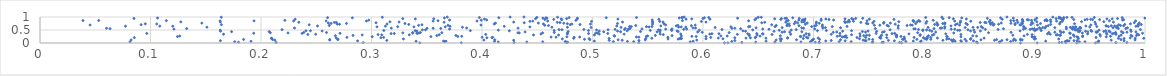
| Category | Series 0 |
|---|---|
| 0.8874117853204427 | 0.001 |
| 0.9383130392352012 | 0.002 |
| 0.9024243052497577 | 0.003 |
| 0.9551818762707995 | 0.004 |
| 0.6194239200750441 | 0.005 |
| 0.34376989689275445 | 0.006 |
| 0.6225813663790141 | 0.007 |
| 0.7797470839452451 | 0.008 |
| 0.3812384314433798 | 0.009 |
| 0.4768851883852392 | 0.01 |
| 0.8483477779431498 | 0.011 |
| 0.7053116924317506 | 0.012 |
| 0.9283258642206476 | 0.013 |
| 0.2924927985265264 | 0.014 |
| 0.9736394388266845 | 0.015 |
| 0.9836523583018227 | 0.016 |
| 0.9224065497863576 | 0.017 |
| 0.42901509922949443 | 0.018 |
| 0.21365363537010196 | 0.019 |
| 0.6351673508141835 | 0.02 |
| 0.5420218229427431 | 0.021 |
| 0.924615316145788 | 0.022 |
| 0.7779224126790676 | 0.023 |
| 0.7620620132401098 | 0.024 |
| 0.701701706354573 | 0.025 |
| 0.7051286134402933 | 0.026 |
| 0.7531521563637567 | 0.027 |
| 0.1796450087162822 | 0.028 |
| 0.47754314144603816 | 0.029 |
| 0.7632223250159949 | 0.03 |
| 0.868154382918569 | 0.031 |
| 0.9580668037224306 | 0.032 |
| 0.753749132467569 | 0.033 |
| 0.6477889585535476 | 0.034 |
| 0.664986416909816 | 0.035 |
| 0.8475552806892548 | 0.036 |
| 0.44057625174129755 | 0.037 |
| 0.9571985644106674 | 0.038 |
| 0.4147441730929578 | 0.039 |
| 0.4752072091520863 | 0.04 |
| 0.6886094760374728 | 0.041 |
| 0.9406482252737258 | 0.042 |
| 0.868799760399531 | 0.043 |
| 0.5883970273256846 | 0.044 |
| 0.08146029462819564 | 0.045 |
| 0.4549578394951104 | 0.046 |
| 0.7232144112385263 | 0.047 |
| 0.6972098812297434 | 0.048 |
| 0.9456472794384384 | 0.049 |
| 0.17622429524262415 | 0.05 |
| 0.7340817588466492 | 0.051 |
| 0.5189203462846952 | 0.052 |
| 0.5372685196248916 | 0.053 |
| 0.9278270877589858 | 0.054 |
| 0.8784007911501208 | 0.055 |
| 0.7968449686767484 | 0.056 |
| 0.47562167751536477 | 0.057 |
| 0.7835596239363156 | 0.058 |
| 0.6260173062117091 | 0.059 |
| 0.36635405198503684 | 0.06 |
| 0.531644379465687 | 0.061 |
| 0.8259658630137685 | 0.062 |
| 0.8337536294329113 | 0.063 |
| 0.4113441293198029 | 0.064 |
| 0.1909723438988555 | 0.065 |
| 0.34035372793807994 | 0.066 |
| 0.8281477854784326 | 0.067 |
| 0.5910888677864203 | 0.068 |
| 0.3673860546116874 | 0.069 |
| 0.6570496152462597 | 0.07 |
| 0.9101174644248593 | 0.071 |
| 0.3651714656968805 | 0.072 |
| 0.7903170055221208 | 0.073 |
| 0.5017034012026388 | 0.074 |
| 0.7974781966237205 | 0.075 |
| 0.8383380356489463 | 0.076 |
| 0.958200542582154 | 0.077 |
| 0.6703292208395912 | 0.078 |
| 0.7111266510560406 | 0.079 |
| 0.9287477583726954 | 0.08 |
| 0.28743905201393155 | 0.081 |
| 0.9312443911991118 | 0.082 |
| 0.8447601030285942 | 0.083 |
| 0.7286414918536218 | 0.084 |
| 0.7731826113477963 | 0.085 |
| 0.9810627498484642 | 0.086 |
| 0.8333150414554711 | 0.087 |
| 0.747536334589459 | 0.088 |
| 0.16326537470962002 | 0.089 |
| 0.9298857479006892 | 0.09 |
| 0.9357279078398784 | 0.091 |
| 0.9386034116247006 | 0.092 |
| 0.7465592067797421 | 0.093 |
| 0.6288352254945148 | 0.094 |
| 0.5420514995684425 | 0.095 |
| 0.8704047116976235 | 0.096 |
| 0.7160767997968895 | 0.097 |
| 0.6985827822400348 | 0.098 |
| 0.8807421288101916 | 0.099 |
| 0.3138249476735683 | 0.1 |
| 0.7677885448344919 | 0.101 |
| 0.515090898844652 | 0.102 |
| 0.817072987291031 | 0.103 |
| 0.8829089607022778 | 0.104 |
| 0.863800681480107 | 0.105 |
| 0.5268830811121472 | 0.106 |
| 0.4286535708365447 | 0.107 |
| 0.969440409912672 | 0.108 |
| 0.7449273315803495 | 0.109 |
| 0.21250316069469818 | 0.11 |
| 0.6989299955615945 | 0.111 |
| 0.2622284488655817 | 0.112 |
| 0.5943905412744519 | 0.113 |
| 0.4017215112637475 | 0.114 |
| 0.824790213435296 | 0.115 |
| 0.6661800751084439 | 0.116 |
| 0.8874174339806783 | 0.117 |
| 0.08245708586949725 | 0.118 |
| 0.9910112338969367 | 0.119 |
| 0.888893210146028 | 0.12 |
| 0.5477638595229355 | 0.121 |
| 0.5231880267570456 | 0.122 |
| 0.8515491665133182 | 0.123 |
| 0.41157375341763053 | 0.124 |
| 0.7244056647519727 | 0.125 |
| 0.6846096263504997 | 0.126 |
| 0.8267270090256246 | 0.127 |
| 0.8751686344587598 | 0.128 |
| 0.4975573723201068 | 0.129 |
| 0.26946475797258906 | 0.13 |
| 0.9782540761489622 | 0.131 |
| 0.8656827021175743 | 0.132 |
| 0.26216306171734827 | 0.133 |
| 0.21048265236301772 | 0.134 |
| 0.7535736454264985 | 0.135 |
| 0.18426987302762757 | 0.136 |
| 0.7055228709478516 | 0.137 |
| 0.8022994445698494 | 0.138 |
| 0.7806012427888532 | 0.139 |
| 0.7935501144067122 | 0.14 |
| 0.49274274940362933 | 0.141 |
| 0.7815583443997981 | 0.142 |
| 0.8420838446685354 | 0.143 |
| 0.8061563414070326 | 0.144 |
| 0.8873570431292878 | 0.145 |
| 0.8370863284753888 | 0.146 |
| 0.2696579891605815 | 0.147 |
| 0.7502193610596494 | 0.148 |
| 0.7001140653462427 | 0.149 |
| 0.5774778892512948 | 0.15 |
| 0.8206153192926584 | 0.151 |
| 0.6709540229616412 | 0.152 |
| 0.9219247117395926 | 0.153 |
| 0.5683823762932845 | 0.154 |
| 0.8815210853337576 | 0.155 |
| 0.8998001274315414 | 0.156 |
| 0.32892147615017836 | 0.157 |
| 0.4726695260376188 | 0.158 |
| 0.8225798142980888 | 0.159 |
| 0.7823655506957067 | 0.16 |
| 0.5802439351306792 | 0.161 |
| 0.6180470585923877 | 0.162 |
| 0.6026859917648637 | 0.163 |
| 0.9008857554105033 | 0.164 |
| 0.7416362173691916 | 0.165 |
| 0.6698258410727423 | 0.166 |
| 0.9397268920848272 | 0.167 |
| 0.8010942747666511 | 0.168 |
| 0.49693872317682997 | 0.169 |
| 0.5787642858301929 | 0.17 |
| 0.9810915791689749 | 0.171 |
| 0.8424145541820238 | 0.172 |
| 0.6907551734459285 | 0.173 |
| 0.5482263609711492 | 0.174 |
| 0.20942112702945162 | 0.175 |
| 0.5804063694078845 | 0.176 |
| 0.5150531694845653 | 0.177 |
| 0.9759584051130931 | 0.178 |
| 0.803003890306053 | 0.179 |
| 0.4829761217270318 | 0.18 |
| 0.9988661898277839 | 0.181 |
| 0.5536498290800896 | 0.182 |
| 0.7609060593285917 | 0.183 |
| 0.20962575413720935 | 0.184 |
| 0.9911356665697256 | 0.185 |
| 0.6570100748305551 | 0.186 |
| 0.5801737484599023 | 0.187 |
| 0.8543938859686531 | 0.188 |
| 0.638899966811864 | 0.189 |
| 0.6138336601873442 | 0.19 |
| 0.812143563660856 | 0.191 |
| 0.7041650509347741 | 0.192 |
| 0.6949779026650742 | 0.193 |
| 0.9325352671620677 | 0.194 |
| 0.267995426656799 | 0.195 |
| 0.6765524779396862 | 0.196 |
| 0.9866336150181223 | 0.197 |
| 0.6765642999644315 | 0.198 |
| 0.642944807867485 | 0.199 |
| 0.6287721120131072 | 0.2 |
| 0.7994628509632695 | 0.201 |
| 0.40441945394721357 | 0.202 |
| 0.3084907259444589 | 0.203 |
| 0.6472901259089532 | 0.204 |
| 0.766282025375963 | 0.205 |
| 0.40897519320984244 | 0.206 |
| 0.7300496978345933 | 0.207 |
| 0.08540508151104756 | 0.208 |
| 0.739356717351729 | 0.209 |
| 0.8061270039850325 | 0.21 |
| 0.7598217508556829 | 0.211 |
| 0.7471797383258708 | 0.212 |
| 0.9556517971621612 | 0.213 |
| 0.6070687274682345 | 0.214 |
| 0.7910080251558921 | 0.215 |
| 0.3109746009182849 | 0.216 |
| 0.4096605866476831 | 0.217 |
| 0.27773431545006566 | 0.218 |
| 0.48342720875085027 | 0.219 |
| 0.5682062361464648 | 0.22 |
| 0.939254595303355 | 0.221 |
| 0.4001224895420217 | 0.222 |
| 0.6937012427535854 | 0.223 |
| 0.6476425828013834 | 0.224 |
| 0.4669422001384891 | 0.225 |
| 0.5420022668834433 | 0.226 |
| 0.4625577241069575 | 0.227 |
| 0.7821704170632338 | 0.228 |
| 0.898272498474863 | 0.229 |
| 0.8029558268685789 | 0.23 |
| 0.48841899787966697 | 0.231 |
| 0.7751404895918977 | 0.232 |
| 0.5397601360150757 | 0.233 |
| 0.7260910358595243 | 0.234 |
| 0.900261742036504 | 0.235 |
| 0.9649453765200645 | 0.236 |
| 0.7277157333557805 | 0.237 |
| 0.47682204243635856 | 0.238 |
| 0.833436179887094 | 0.239 |
| 0.938411257643768 | 0.24 |
| 0.3006903625485065 | 0.241 |
| 0.8208333335219181 | 0.242 |
| 0.897803927944689 | 0.243 |
| 0.3537381832546603 | 0.244 |
| 0.9434812674404818 | 0.245 |
| 0.7284639161009734 | 0.246 |
| 0.6884126910037355 | 0.247 |
| 0.8206595108975997 | 0.248 |
| 0.12445060829562603 | 0.249 |
| 0.3780391836788983 | 0.25 |
| 0.7791268503531376 | 0.251 |
| 0.5938200803602288 | 0.252 |
| 0.6027121104974751 | 0.253 |
| 0.5487573471005489 | 0.254 |
| 0.688090088012237 | 0.255 |
| 0.5899535586640975 | 0.256 |
| 0.7215380260215375 | 0.257 |
| 0.38165477396488323 | 0.258 |
| 0.7608987858375367 | 0.259 |
| 0.9359503931883444 | 0.26 |
| 0.9687510325925419 | 0.261 |
| 0.9765980647950231 | 0.262 |
| 0.9883659610295626 | 0.263 |
| 0.8475533073859256 | 0.264 |
| 0.6516202817235814 | 0.265 |
| 0.5200666554874201 | 0.266 |
| 0.7422235368111971 | 0.267 |
| 0.12652667088690173 | 0.268 |
| 0.6219018273848853 | 0.269 |
| 0.5804345489993776 | 0.27 |
| 0.9436131903049595 | 0.271 |
| 0.5499368140037282 | 0.272 |
| 0.6162021598949152 | 0.273 |
| 0.959580501583666 | 0.274 |
| 0.8905051962528463 | 0.275 |
| 0.7751328694176554 | 0.276 |
| 0.8441676290033951 | 0.277 |
| 0.6699824122450122 | 0.278 |
| 0.804045843707249 | 0.279 |
| 0.7293045522232586 | 0.28 |
| 0.5196216029565138 | 0.281 |
| 0.7454819346833227 | 0.282 |
| 0.2672767036315868 | 0.283 |
| 0.5719810022877557 | 0.284 |
| 0.7238948704503261 | 0.285 |
| 0.35912846268976 | 0.286 |
| 0.9922914474841612 | 0.287 |
| 0.6419047875712314 | 0.288 |
| 0.691384483663926 | 0.289 |
| 0.7964284421805177 | 0.29 |
| 0.5568657156569151 | 0.291 |
| 0.283267014019812 | 0.292 |
| 0.7748523750439619 | 0.293 |
| 0.37637173632425835 | 0.294 |
| 0.9235191201185918 | 0.295 |
| 0.922863368319609 | 0.296 |
| 0.7505546511099703 | 0.297 |
| 0.9872583169329222 | 0.298 |
| 0.7615718728761607 | 0.299 |
| 0.7480348099074285 | 0.3 |
| 0.6959958425768454 | 0.301 |
| 0.8804022711381326 | 0.302 |
| 0.7752930578048489 | 0.303 |
| 0.807634045672971 | 0.304 |
| 0.9784467496619411 | 0.305 |
| 0.4693119647195432 | 0.306 |
| 0.6489946454060663 | 0.307 |
| 0.5016707706251612 | 0.308 |
| 0.44661856471344025 | 0.309 |
| 0.29157501150158216 | 0.31 |
| 0.9196388101760768 | 0.311 |
| 0.7662989646425397 | 0.312 |
| 0.9350976844039944 | 0.313 |
| 0.3093060294728661 | 0.314 |
| 0.9943744818722613 | 0.315 |
| 0.33418291067485756 | 0.316 |
| 0.7344414946101138 | 0.317 |
| 0.3613246832091799 | 0.318 |
| 0.9207783996673335 | 0.319 |
| 0.7966294251877335 | 0.32 |
| 0.8978180621245277 | 0.321 |
| 0.5640792357091319 | 0.322 |
| 0.9591804230851616 | 0.323 |
| 0.3059556972559666 | 0.324 |
| 0.6417987414156513 | 0.325 |
| 0.8089139426025649 | 0.326 |
| 0.8333774214923396 | 0.327 |
| 0.24236808928574102 | 0.328 |
| 0.6625094887346048 | 0.329 |
| 0.4033490373209601 | 0.33 |
| 0.973792865018221 | 0.331 |
| 0.8935768386562104 | 0.332 |
| 0.6310592483805456 | 0.333 |
| 0.7161160695623828 | 0.334 |
| 0.24948790358803785 | 0.335 |
| 0.6793770864626558 | 0.336 |
| 0.9654809109404003 | 0.337 |
| 0.16609073854467396 | 0.338 |
| 0.9142426832625551 | 0.339 |
| 0.5286077258462026 | 0.34 |
| 0.9930455444778252 | 0.341 |
| 0.5612999610566829 | 0.342 |
| 0.6060727483809413 | 0.343 |
| 0.5060959047023073 | 0.344 |
| 0.5798438288571713 | 0.345 |
| 0.695984485184101 | 0.346 |
| 0.6544400887395394 | 0.347 |
| 0.45331579789932397 | 0.348 |
| 0.47717108857934576 | 0.349 |
| 0.7863962391567108 | 0.35 |
| 0.8197005507341798 | 0.351 |
| 0.9480335298416495 | 0.352 |
| 0.911814296119867 | 0.353 |
| 0.6538142930526923 | 0.354 |
| 0.970611714687106 | 0.355 |
| 0.7420121859596408 | 0.356 |
| 0.6404897279849858 | 0.357 |
| 0.6144497557756429 | 0.358 |
| 0.6080758662822474 | 0.359 |
| 0.6933479601045233 | 0.36 |
| 0.7710526552381178 | 0.361 |
| 0.3177137203077505 | 0.362 |
| 0.4964220827885497 | 0.363 |
| 0.6486603199630748 | 0.364 |
| 0.3206162223528024 | 0.365 |
| 0.5138019929069739 | 0.366 |
| 0.3416367619252214 | 0.367 |
| 0.09658714731065947 | 0.368 |
| 0.7566608920231481 | 0.369 |
| 0.23718586586265783 | 0.37 |
| 0.9734309150817827 | 0.371 |
| 0.932377144634735 | 0.372 |
| 0.7734354834274706 | 0.373 |
| 0.27150306404281044 | 0.374 |
| 0.1933864445555778 | 0.375 |
| 0.9977854986956065 | 0.376 |
| 0.7239845648086853 | 0.377 |
| 0.9721558054447156 | 0.378 |
| 0.5028834864992298 | 0.379 |
| 0.9651436366250928 | 0.38 |
| 0.3374028455254755 | 0.381 |
| 0.3409866830778915 | 0.382 |
| 0.9318119902319982 | 0.383 |
| 0.9433089435298295 | 0.384 |
| 0.5045923778673947 | 0.385 |
| 0.8269252133783568 | 0.386 |
| 0.43371761635485545 | 0.387 |
| 0.22443852954170557 | 0.388 |
| 0.3430658936165227 | 0.389 |
| 0.3283312452400225 | 0.39 |
| 0.4548800759552258 | 0.391 |
| 0.4774608197811598 | 0.392 |
| 0.20844225283013407 | 0.393 |
| 0.432576516921205 | 0.394 |
| 0.9802204397888348 | 0.395 |
| 0.3636447155798477 | 0.396 |
| 0.8583866746977649 | 0.397 |
| 0.794243647747839 | 0.398 |
| 0.33720239936678587 | 0.399 |
| 0.6236947946109151 | 0.4 |
| 0.9241306765491091 | 0.401 |
| 0.9734428599093545 | 0.402 |
| 0.25926672929802863 | 0.403 |
| 0.34428949883907783 | 0.404 |
| 0.23875550173627055 | 0.405 |
| 0.9129369630116192 | 0.406 |
| 0.4654039197640408 | 0.407 |
| 0.9564900226810434 | 0.408 |
| 0.7179031992020433 | 0.409 |
| 0.8788477989199643 | 0.41 |
| 0.5993102301046983 | 0.411 |
| 0.7623883037264003 | 0.412 |
| 0.6715859880783818 | 0.413 |
| 0.9184053627954005 | 0.414 |
| 0.9836939425279498 | 0.415 |
| 0.9262691385643654 | 0.416 |
| 0.8458348443453048 | 0.417 |
| 0.6784982832361325 | 0.418 |
| 0.8105828654015333 | 0.419 |
| 0.7470775228266555 | 0.42 |
| 0.9685348013846381 | 0.421 |
| 0.9556539257233849 | 0.422 |
| 0.7210086965625279 | 0.423 |
| 0.5951715532602526 | 0.424 |
| 0.43895498148503664 | 0.425 |
| 0.9917598055937317 | 0.426 |
| 0.9482805305742973 | 0.427 |
| 0.5584147932547178 | 0.428 |
| 0.5101773023097788 | 0.429 |
| 0.5609750011629535 | 0.43 |
| 0.6737459168172507 | 0.431 |
| 0.5254150184441087 | 0.432 |
| 0.689459712708363 | 0.433 |
| 0.7639805198120312 | 0.434 |
| 0.1733830873583795 | 0.435 |
| 0.9405904935448133 | 0.436 |
| 0.978710105379341 | 0.437 |
| 0.5775393093090228 | 0.438 |
| 0.20739699548067678 | 0.439 |
| 0.956969742171984 | 0.44 |
| 0.7442649920036222 | 0.441 |
| 0.4779865764648505 | 0.442 |
| 0.5434619419482511 | 0.443 |
| 0.939500301694357 | 0.444 |
| 0.9627308230894636 | 0.445 |
| 0.9874583399102825 | 0.446 |
| 0.7571864378624957 | 0.447 |
| 0.9518114630858466 | 0.448 |
| 0.6643230896445931 | 0.449 |
| 0.6385333595516326 | 0.45 |
| 0.9461792030383929 | 0.451 |
| 0.8070769963556151 | 0.452 |
| 0.726411154343535 | 0.453 |
| 0.16341174298381295 | 0.454 |
| 0.9233019116706416 | 0.455 |
| 0.9673683650993137 | 0.456 |
| 0.5226462504605238 | 0.457 |
| 0.5061433985447417 | 0.458 |
| 0.34103225747893906 | 0.459 |
| 0.7493780030025361 | 0.46 |
| 0.255303787455432 | 0.461 |
| 0.8510318178058996 | 0.462 |
| 0.8421304393152907 | 0.463 |
| 0.8869551946555913 | 0.464 |
| 0.5765267176616539 | 0.465 |
| 0.636120080155139 | 0.466 |
| 0.4247318280743237 | 0.467 |
| 0.5313702638967791 | 0.468 |
| 0.9644546465849205 | 0.469 |
| 0.2407076579913355 | 0.47 |
| 0.9412676268643817 | 0.471 |
| 0.24472566430855272 | 0.472 |
| 0.7344346781855212 | 0.473 |
| 0.3395633423910111 | 0.474 |
| 0.7035558433275889 | 0.475 |
| 0.3894474740919611 | 0.476 |
| 0.9059482796391124 | 0.477 |
| 0.4653562750047448 | 0.478 |
| 0.7116626806373743 | 0.479 |
| 0.7988425371360179 | 0.48 |
| 0.3111670454332353 | 0.481 |
| 0.5716859179548494 | 0.482 |
| 0.4964008810747168 | 0.483 |
| 0.5523139302618787 | 0.484 |
| 0.9008537362461031 | 0.485 |
| 0.9511242142819235 | 0.486 |
| 0.6690071659356175 | 0.487 |
| 0.8305212435517145 | 0.488 |
| 0.8323418839535323 | 0.489 |
| 0.8051285789967397 | 0.49 |
| 0.8998487468236877 | 0.491 |
| 0.5966552849754336 | 0.492 |
| 0.16314405608058047 | 0.493 |
| 0.9583624975408641 | 0.494 |
| 0.4147873254888884 | 0.495 |
| 0.5612931129882183 | 0.496 |
| 0.8451154863520662 | 0.497 |
| 0.9369372884648688 | 0.498 |
| 0.5037119856176673 | 0.499 |
| 0.80232002412887 | 0.5 |
| 0.679884977676512 | 0.501 |
| 0.9870159559684342 | 0.502 |
| 0.7989961275824639 | 0.503 |
| 0.64501520999248 | 0.504 |
| 0.5597248690988682 | 0.505 |
| 0.34605071986570035 | 0.506 |
| 0.34883600776789786 | 0.507 |
| 0.8397446132934078 | 0.508 |
| 0.5140692581073053 | 0.509 |
| 0.7693320467299294 | 0.51 |
| 0.5714638874159521 | 0.511 |
| 0.47237091233992307 | 0.512 |
| 0.21905979833791986 | 0.513 |
| 0.9385244637024126 | 0.514 |
| 0.469701204450793 | 0.515 |
| 0.6843057502398214 | 0.516 |
| 0.6172423250787216 | 0.517 |
| 0.9958893592123742 | 0.518 |
| 0.7950305640607601 | 0.519 |
| 0.8670531116364679 | 0.52 |
| 0.5290337574879608 | 0.521 |
| 0.4921803231086079 | 0.522 |
| 0.8960604899923524 | 0.523 |
| 0.8555266481397608 | 0.524 |
| 0.5204357421052299 | 0.525 |
| 0.5825874919614904 | 0.526 |
| 0.6597388867539803 | 0.527 |
| 0.9024050670860075 | 0.528 |
| 0.9346674096518849 | 0.529 |
| 0.8278742987701662 | 0.53 |
| 0.8246181174512239 | 0.531 |
| 0.8900026704409152 | 0.532 |
| 0.5662237458442788 | 0.533 |
| 0.12122565053460403 | 0.534 |
| 0.5325581199022507 | 0.535 |
| 0.3706408593825129 | 0.536 |
| 0.585262470628399 | 0.537 |
| 0.905720078508653 | 0.538 |
| 0.6540832573939013 | 0.539 |
| 0.5330550666530854 | 0.54 |
| 0.7011120787292014 | 0.541 |
| 0.5447852954769405 | 0.542 |
| 0.5719006026014941 | 0.543 |
| 0.7908369711099432 | 0.544 |
| 0.7921209967303047 | 0.545 |
| 0.9398796124750899 | 0.546 |
| 0.897896596160318 | 0.547 |
| 0.9288566361722914 | 0.548 |
| 0.871890555010776 | 0.549 |
| 0.8998735632991699 | 0.55 |
| 0.6340506790057734 | 0.551 |
| 0.9364138393588424 | 0.552 |
| 0.06340952983552095 | 0.553 |
| 0.13277720679373603 | 0.554 |
| 0.8090350082008461 | 0.555 |
| 0.7559380281019675 | 0.556 |
| 0.5297130803210385 | 0.557 |
| 0.9826368350055072 | 0.558 |
| 0.9759074884075462 | 0.559 |
| 0.5339110516236945 | 0.56 |
| 0.36265220270637294 | 0.561 |
| 0.8918716063574524 | 0.562 |
| 0.9339817646022078 | 0.563 |
| 0.6261529661827742 | 0.564 |
| 0.06022776100575168 | 0.565 |
| 0.35027457237168874 | 0.566 |
| 0.355808697947712 | 0.567 |
| 0.628841020439371 | 0.568 |
| 0.6910356258815911 | 0.569 |
| 0.776626039428119 | 0.57 |
| 0.8147091527369344 | 0.571 |
| 0.4326253436818717 | 0.572 |
| 0.31795268605060156 | 0.573 |
| 0.8187000191041996 | 0.574 |
| 0.7084185610979488 | 0.575 |
| 0.2303280345710581 | 0.576 |
| 0.593260244605511 | 0.577 |
| 0.3861172187215536 | 0.578 |
| 0.941917727537004 | 0.579 |
| 0.9095485441310185 | 0.58 |
| 0.8159968302711621 | 0.581 |
| 0.6893581453784381 | 0.582 |
| 0.5908870027695292 | 0.583 |
| 0.6480669689320282 | 0.584 |
| 0.8531198098365966 | 0.585 |
| 0.9043882620465057 | 0.586 |
| 0.984174436922595 | 0.587 |
| 0.7245205233486666 | 0.588 |
| 0.9741819082670892 | 0.589 |
| 0.9710740640326573 | 0.59 |
| 0.9183605947021645 | 0.591 |
| 0.7107352776170097 | 0.592 |
| 0.6716361298756709 | 0.593 |
| 0.8372687816404446 | 0.594 |
| 0.9075132014130424 | 0.595 |
| 0.6109894279119307 | 0.596 |
| 0.49876623677758786 | 0.597 |
| 0.9751051760795747 | 0.598 |
| 0.8485640899598255 | 0.599 |
| 0.8036753902162975 | 0.6 |
| 0.5258112552763986 | 0.601 |
| 0.93245055727748 | 0.602 |
| 0.8444080685212269 | 0.603 |
| 0.3822765424772112 | 0.604 |
| 0.4772827950870375 | 0.605 |
| 0.941175054904359 | 0.606 |
| 0.4632616683900582 | 0.607 |
| 0.15109429288304058 | 0.608 |
| 0.9287482675712273 | 0.609 |
| 0.8904395428206251 | 0.61 |
| 0.5844441143293222 | 0.611 |
| 0.5779872303555752 | 0.612 |
| 0.9370425346141439 | 0.613 |
| 0.9374475039823023 | 0.614 |
| 0.9347334813626385 | 0.615 |
| 0.5511800504038622 | 0.616 |
| 0.9500227077396772 | 0.617 |
| 0.5802897426797861 | 0.618 |
| 0.44332300304600064 | 0.619 |
| 0.3383817560210382 | 0.62 |
| 0.3049637870041027 | 0.621 |
| 0.6252931206611366 | 0.622 |
| 0.3667937938235211 | 0.623 |
| 0.641269402194177 | 0.624 |
| 0.5488415919735494 | 0.625 |
| 0.32372493638079897 | 0.626 |
| 0.8188783604868145 | 0.627 |
| 0.6651700227697869 | 0.628 |
| 0.5351440135951591 | 0.629 |
| 0.7169663252781473 | 0.63 |
| 0.6983500187291393 | 0.631 |
| 0.8518283281465305 | 0.632 |
| 0.9564395397479816 | 0.633 |
| 0.9668547588155394 | 0.634 |
| 0.6423903073713323 | 0.635 |
| 0.5538587638510556 | 0.636 |
| 0.5336466876527209 | 0.637 |
| 0.9104486699144069 | 0.638 |
| 0.7303542845595855 | 0.639 |
| 0.7079189737014099 | 0.64 |
| 0.8901160030268518 | 0.641 |
| 0.420101166900715 | 0.642 |
| 0.37106062659419753 | 0.643 |
| 0.9917954523048506 | 0.644 |
| 0.12013670240709573 | 0.645 |
| 0.07735237846617699 | 0.646 |
| 0.9936573038244068 | 0.647 |
| 0.31260394422365373 | 0.648 |
| 0.108396532008502 | 0.649 |
| 0.7677962419871006 | 0.65 |
| 0.9747431783976505 | 0.651 |
| 0.5219553119511736 | 0.652 |
| 0.25112483213560777 | 0.653 |
| 0.9464975769143661 | 0.654 |
| 0.8243968122510378 | 0.655 |
| 0.7010396397825504 | 0.656 |
| 0.9646968829780295 | 0.657 |
| 0.5618447193836038 | 0.658 |
| 0.9725904185968425 | 0.659 |
| 0.575824831986181 | 0.66 |
| 0.7766648274761171 | 0.661 |
| 0.9649745363945149 | 0.662 |
| 0.9806641549930635 | 0.663 |
| 0.9695080755445262 | 0.664 |
| 0.6759042000716733 | 0.665 |
| 0.6782288178377005 | 0.666 |
| 0.68685688837015 | 0.667 |
| 0.5894751435318514 | 0.668 |
| 0.9124342698139616 | 0.669 |
| 0.4602279733121679 | 0.67 |
| 0.7846686838413229 | 0.671 |
| 0.2617786683992716 | 0.672 |
| 0.9778995768825888 | 0.673 |
| 0.5391267178517704 | 0.674 |
| 0.6662598241722706 | 0.675 |
| 0.9939584410289541 | 0.676 |
| 0.5773123206419498 | 0.677 |
| 0.7666079696490623 | 0.678 |
| 0.34264074768236785 | 0.679 |
| 0.7024672477901442 | 0.68 |
| 0.8122350897449949 | 0.681 |
| 0.36925329691543374 | 0.682 |
| 0.4568379335532557 | 0.683 |
| 0.7550450036752244 | 0.684 |
| 0.7600371885561114 | 0.685 |
| 0.8625187516249618 | 0.686 |
| 0.7893724170073549 | 0.687 |
| 0.5929690145622384 | 0.688 |
| 0.8321679615848052 | 0.689 |
| 0.3990439111448923 | 0.69 |
| 0.7080659457667976 | 0.691 |
| 0.04531510024630116 | 0.692 |
| 0.9026742225687211 | 0.693 |
| 0.787845903578607 | 0.694 |
| 0.9510412991102617 | 0.695 |
| 0.5661509179079053 | 0.696 |
| 0.8868709246238622 | 0.697 |
| 0.8876174403149847 | 0.698 |
| 0.8284162587569366 | 0.699 |
| 0.24360933730645248 | 0.7 |
| 0.3456646455290117 | 0.701 |
| 0.6621520846648917 | 0.702 |
| 0.9763090412852158 | 0.703 |
| 0.09154606096150465 | 0.704 |
| 0.16414708207649065 | 0.705 |
| 0.8823746473323012 | 0.706 |
| 0.47986627532536535 | 0.707 |
| 0.8967334544285182 | 0.708 |
| 0.8392808094728491 | 0.709 |
| 0.4886710601935464 | 0.71 |
| 0.8124705391499603 | 0.711 |
| 0.996623770095529 | 0.712 |
| 0.9816581233723404 | 0.713 |
| 0.8096236291452428 | 0.714 |
| 0.33370489824425786 | 0.715 |
| 0.9146725410769383 | 0.716 |
| 0.9938257533615409 | 0.717 |
| 0.8634102147402228 | 0.718 |
| 0.2710763902089515 | 0.719 |
| 0.692632118259218 | 0.72 |
| 0.8675336672933524 | 0.721 |
| 0.8602738051575884 | 0.722 |
| 0.6764629712132311 | 0.723 |
| 0.7739450855556516 | 0.724 |
| 0.9553043360992375 | 0.725 |
| 0.2690306205564078 | 0.726 |
| 0.4813966440460135 | 0.727 |
| 0.49815158335451915 | 0.728 |
| 0.5543229996104968 | 0.729 |
| 0.411046228993613 | 0.73 |
| 0.3141241885593449 | 0.731 |
| 0.455560114105686 | 0.732 |
| 0.10565898832776538 | 0.733 |
| 0.6778379803002 | 0.734 |
| 0.9227078411900664 | 0.735 |
| 0.9868072484131234 | 0.736 |
| 0.0953193076488695 | 0.737 |
| 0.8299782477067851 | 0.738 |
| 0.5646486474655575 | 0.739 |
| 0.8188177201811205 | 0.74 |
| 0.9361803318937635 | 0.741 |
| 0.7491698169978551 | 0.742 |
| 0.6826090016780585 | 0.743 |
| 0.7925171055548461 | 0.744 |
| 0.47727389113398705 | 0.745 |
| 0.9054140563807838 | 0.746 |
| 0.8824714222930072 | 0.747 |
| 0.8169933209491863 | 0.748 |
| 0.8891225110881025 | 0.749 |
| 0.33028080676218885 | 0.75 |
| 0.2773684218002909 | 0.751 |
| 0.5226439791101235 | 0.752 |
| 0.898308755585947 | 0.753 |
| 0.26338224105474334 | 0.754 |
| 0.7478316764808682 | 0.755 |
| 0.8379362990505145 | 0.756 |
| 0.8786185435315568 | 0.757 |
| 0.7051898144536091 | 0.758 |
| 0.763496670244272 | 0.759 |
| 0.8018301010389742 | 0.76 |
| 0.8602093310534523 | 0.761 |
| 0.47399010667313773 | 0.762 |
| 0.7695896401843928 | 0.763 |
| 0.4121608144596229 | 0.764 |
| 0.14646552116208456 | 0.765 |
| 0.7024082749725543 | 0.766 |
| 0.45101126525624863 | 0.767 |
| 0.6944014308394998 | 0.768 |
| 0.2609113804881886 | 0.769 |
| 0.869883787406614 | 0.77 |
| 0.9948193792769002 | 0.771 |
| 0.8188976055680016 | 0.772 |
| 0.7535827087565232 | 0.773 |
| 0.6855814051549698 | 0.774 |
| 0.8885027407718202 | 0.775 |
| 0.8116948927130944 | 0.776 |
| 0.3040855617133538 | 0.777 |
| 0.6531668358794152 | 0.778 |
| 0.8561646875632015 | 0.779 |
| 0.43821112577470533 | 0.78 |
| 0.861724784200508 | 0.781 |
| 0.554424889714905 | 0.782 |
| 0.9902969363722215 | 0.783 |
| 0.7288314321280351 | 0.784 |
| 0.47055033526373435 | 0.785 |
| 0.9232373841997802 | 0.786 |
| 0.8327961986659093 | 0.787 |
| 0.8508727043983226 | 0.788 |
| 0.2681428089733851 | 0.789 |
| 0.8848397714337993 | 0.79 |
| 0.26638300805741066 | 0.791 |
| 0.7636661966493442 | 0.792 |
| 0.7428450278528698 | 0.793 |
| 0.8550177072796723 | 0.794 |
| 0.46811930182077666 | 0.795 |
| 0.8975602687910351 | 0.796 |
| 0.23420949431287516 | 0.797 |
| 0.6559150153958452 | 0.798 |
| 0.9547756561074238 | 0.799 |
| 0.3656695085807706 | 0.8 |
| 0.7026363248096796 | 0.801 |
| 0.9714210784201037 | 0.802 |
| 0.6749020871492514 | 0.803 |
| 0.6026928433958455 | 0.804 |
| 0.4287016642180955 | 0.805 |
| 0.5271387084629928 | 0.806 |
| 0.5638547427016138 | 0.807 |
| 0.3249699108139786 | 0.808 |
| 0.6894209818590121 | 0.809 |
| 0.16318956388422146 | 0.81 |
| 0.6916830369224952 | 0.811 |
| 0.12743644006437987 | 0.812 |
| 0.7307613352596658 | 0.813 |
| 0.6836195278342548 | 0.814 |
| 0.31669194595823974 | 0.815 |
| 0.7325348536397499 | 0.816 |
| 0.7938222218600867 | 0.817 |
| 0.9146709764395606 | 0.818 |
| 0.7772150946812637 | 0.819 |
| 0.9020671580735473 | 0.82 |
| 0.9425895252777926 | 0.821 |
| 0.9627087728487094 | 0.822 |
| 0.8591065983496099 | 0.823 |
| 0.5544040796734001 | 0.824 |
| 0.7281719726496888 | 0.825 |
| 0.8024592151563827 | 0.826 |
| 0.5985286719086486 | 0.827 |
| 0.7908825675245116 | 0.828 |
| 0.9249964419087782 | 0.829 |
| 0.5608279888580839 | 0.83 |
| 0.8895819026097456 | 0.831 |
| 0.4991509081174386 | 0.832 |
| 0.796220774032042 | 0.833 |
| 0.4433646850730466 | 0.834 |
| 0.7547494759315413 | 0.835 |
| 0.7361388234301622 | 0.836 |
| 0.8423269590532997 | 0.837 |
| 0.6756189762439451 | 0.838 |
| 0.8330283963564221 | 0.839 |
| 0.9199666137047307 | 0.84 |
| 0.4460382295444809 | 0.841 |
| 0.35578008721475546 | 0.842 |
| 0.4594322929577663 | 0.843 |
| 0.8277969657626238 | 0.844 |
| 0.2954064945920306 | 0.845 |
| 0.3955059937090861 | 0.846 |
| 0.2589294055779394 | 0.847 |
| 0.790294872426222 | 0.848 |
| 0.22953021077346047 | 0.849 |
| 0.1629056825172942 | 0.85 |
| 0.9915282796230649 | 0.851 |
| 0.19367896685999927 | 0.852 |
| 0.6412825547373291 | 0.853 |
| 0.7484697673971313 | 0.854 |
| 0.9678001016321187 | 0.855 |
| 0.36017697016642436 | 0.856 |
| 0.8811982895188868 | 0.857 |
| 0.9112895406340857 | 0.858 |
| 0.11433577010552216 | 0.859 |
| 0.5813764817618956 | 0.86 |
| 0.9113984670019643 | 0.861 |
| 0.03891680412539166 | 0.862 |
| 0.8785277736786338 | 0.863 |
| 0.9253991205727539 | 0.864 |
| 0.7951454106414834 | 0.865 |
| 0.9093824651477538 | 0.866 |
| 0.7901937286942708 | 0.867 |
| 0.053124567242829795 | 0.868 |
| 0.7068784020301925 | 0.869 |
| 0.6770978377155905 | 0.87 |
| 0.484993967751212 | 0.871 |
| 0.22159602325144573 | 0.872 |
| 0.8841077487273679 | 0.873 |
| 0.8973052821299666 | 0.874 |
| 0.8082947060699205 | 0.875 |
| 0.7320591703912 | 0.876 |
| 0.39928696425281407 | 0.877 |
| 0.8598939257684343 | 0.878 |
| 0.297527755017142 | 0.879 |
| 0.6867195270476693 | 0.88 |
| 0.8893526385725796 | 0.881 |
| 0.3706184912057516 | 0.882 |
| 0.6919371380364302 | 0.883 |
| 0.6897172680999535 | 0.884 |
| 0.9796371129501148 | 0.885 |
| 0.7181775855908169 | 0.886 |
| 0.40425252367123504 | 0.887 |
| 0.554043152632323 | 0.888 |
| 0.8945899689231183 | 0.889 |
| 0.914480319827887 | 0.89 |
| 0.9456878325802494 | 0.891 |
| 0.6469144159913728 | 0.892 |
| 0.900437273813853 | 0.893 |
| 0.6907327188884321 | 0.894 |
| 0.4721927993733321 | 0.895 |
| 0.8934300525782024 | 0.896 |
| 0.9526089764416416 | 0.897 |
| 0.9806716405347419 | 0.898 |
| 0.9589299161133317 | 0.899 |
| 0.9106394995328637 | 0.9 |
| 0.73590211632424 | 0.901 |
| 0.8889703825440894 | 0.902 |
| 0.9354753361566979 | 0.903 |
| 0.7140038028145927 | 0.904 |
| 0.4568716840947725 | 0.905 |
| 0.6704141458498939 | 0.906 |
| 0.4649002033573379 | 0.907 |
| 0.7728609319435438 | 0.908 |
| 0.9246320456949034 | 0.909 |
| 0.9508294952420907 | 0.91 |
| 0.947722239541778 | 0.911 |
| 0.8707594534315231 | 0.912 |
| 0.560025379090946 | 0.913 |
| 0.230915845304698 | 0.914 |
| 0.6062989827190787 | 0.915 |
| 0.5847197317051076 | 0.916 |
| 0.7069914000165435 | 0.917 |
| 0.7506008115534178 | 0.918 |
| 0.40227676981737287 | 0.919 |
| 0.5230035556594188 | 0.92 |
| 0.9261799936267936 | 0.921 |
| 0.6924367613557669 | 0.922 |
| 0.7111487930240667 | 0.923 |
| 0.838344656582065 | 0.924 |
| 0.33966770881718045 | 0.925 |
| 0.9655143628657494 | 0.926 |
| 0.5898500441054803 | 0.927 |
| 0.47164478849497526 | 0.928 |
| 0.7285006676329258 | 0.929 |
| 0.9702970661200295 | 0.93 |
| 0.6648971869200483 | 0.931 |
| 0.3563555274194951 | 0.932 |
| 0.8264901179845072 | 0.933 |
| 0.8172303649292314 | 0.934 |
| 0.4862563354406356 | 0.935 |
| 0.4484460334675966 | 0.936 |
| 0.32828476785910987 | 0.937 |
| 0.4765741415640169 | 0.938 |
| 0.734605925257119 | 0.939 |
| 0.9751346914423554 | 0.94 |
| 0.9195538183124228 | 0.941 |
| 0.599898165953284 | 0.942 |
| 0.6709858649949632 | 0.943 |
| 0.6481553977859418 | 0.944 |
| 0.08501137527849309 | 0.945 |
| 0.7381980276772219 | 0.946 |
| 0.687128732042567 | 0.947 |
| 0.6742295626376723 | 0.948 |
| 0.6755623659535613 | 0.949 |
| 0.45875140929280034 | 0.95 |
| 0.7445690074899081 | 0.951 |
| 0.8573308672238182 | 0.952 |
| 0.90201227690399 | 0.953 |
| 0.4863552015481774 | 0.954 |
| 0.6313036940146532 | 0.955 |
| 0.4551249645711126 | 0.956 |
| 0.9236215080793251 | 0.957 |
| 0.8807851433756373 | 0.958 |
| 0.9230751911671491 | 0.959 |
| 0.99988212662879 | 0.96 |
| 0.9222568871756277 | 0.961 |
| 0.10641893768314518 | 0.962 |
| 0.3659679818423224 | 0.963 |
| 0.5785617121785901 | 0.964 |
| 0.8341386392929777 | 0.965 |
| 0.5812651396212479 | 0.966 |
| 0.282652217574899 | 0.967 |
| 0.8693532727978356 | 0.968 |
| 0.681207382858931 | 0.969 |
| 0.6012688904726892 | 0.97 |
| 0.45792344947955316 | 0.971 |
| 0.5124070729091911 | 0.972 |
| 0.41521299504728365 | 0.973 |
| 0.8227806963638867 | 0.974 |
| 0.26022824808648704 | 0.975 |
| 0.9793523869037676 | 0.976 |
| 0.47884774609068237 | 0.977 |
| 0.9264825685825744 | 0.978 |
| 0.3976290492179093 | 0.979 |
| 0.5398133463272206 | 0.98 |
| 0.6051529040880095 | 0.981 |
| 0.9541345772416482 | 0.982 |
| 0.8015717126258849 | 0.983 |
| 0.4496952264472632 | 0.984 |
| 0.9292929923781766 | 0.985 |
| 0.9339259974336662 | 0.986 |
| 0.5809517182969147 | 0.987 |
| 0.4683593902761857 | 0.988 |
| 0.6527724773052294 | 0.989 |
| 0.3097829919627758 | 0.99 |
| 0.16405305399815162 | 0.991 |
| 0.6500759977017356 | 0.992 |
| 0.9223678775441141 | 0.993 |
| 0.8161834988088092 | 0.994 |
| 0.9165483585122552 | 0.995 |
| 0.36856553608664405 | 0.996 |
| 0.4254731410522633 | 0.997 |
| 0.5829886358565195 | 0.998 |
| 0.875068392315847 | 0.999 |
| 0.4379626343724178 | 1 |